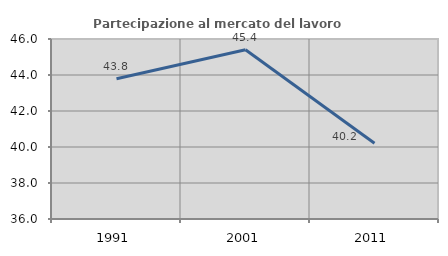
| Category | Partecipazione al mercato del lavoro  femminile |
|---|---|
| 1991.0 | 43.789 |
| 2001.0 | 45.406 |
| 2011.0 | 40.212 |